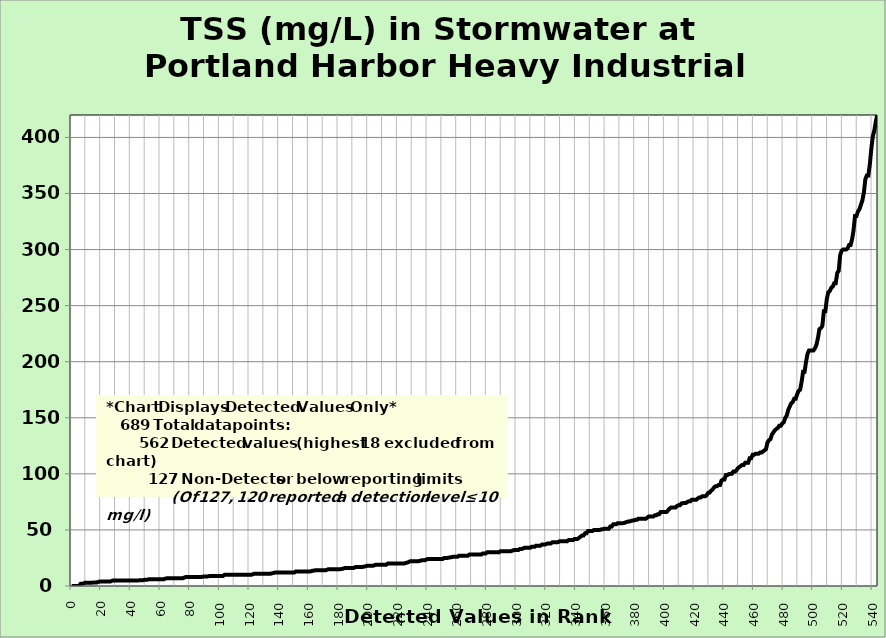
| Category | TSS |
|---|---|
| 0.0 | 0.005 |
| 1.0 | 0.008 |
| 2.0 | 0.01 |
| 3.0 | 0.016 |
| 4.0 | 0.082 |
| 5.0 | 0.092 |
| 6.0 | 2 |
| 7.0 | 2 |
| 8.0 | 2.2 |
| 9.0 | 3 |
| 10.0 | 3 |
| 11.0 | 3 |
| 12.0 | 3 |
| 13.0 | 3 |
| 14.0 | 3 |
| 15.0 | 3.2 |
| 16.0 | 3.2 |
| 17.0 | 3.2 |
| 18.0 | 3.8 |
| 19.0 | 3.9 |
| 20.0 | 4 |
| 21.0 | 4 |
| 22.0 | 4 |
| 23.0 | 4 |
| 24.0 | 4 |
| 25.0 | 4 |
| 26.0 | 4 |
| 27.0 | 4.52 |
| 28.0 | 5 |
| 29.0 | 5 |
| 30.0 | 5 |
| 31.0 | 5 |
| 32.0 | 5 |
| 33.0 | 5 |
| 34.0 | 5 |
| 35.0 | 5 |
| 36.0 | 5 |
| 37.0 | 5 |
| 38.0 | 5 |
| 39.0 | 5 |
| 40.0 | 5 |
| 41.0 | 5 |
| 42.0 | 5 |
| 43.0 | 5 |
| 44.0 | 5 |
| 45.0 | 5 |
| 46.0 | 5.1 |
| 47.0 | 5.2 |
| 48.0 | 5.2 |
| 49.0 | 5.5 |
| 50.0 | 5.6 |
| 51.0 | 5.6 |
| 52.0 | 6 |
| 53.0 | 6 |
| 54.0 | 6 |
| 55.0 | 6 |
| 56.0 | 6 |
| 57.0 | 6 |
| 58.0 | 6 |
| 59.0 | 6 |
| 60.0 | 6 |
| 61.0 | 6 |
| 62.0 | 6 |
| 63.0 | 6.57 |
| 64.0 | 6.8 |
| 65.0 | 6.86 |
| 66.0 | 7 |
| 67.0 | 7 |
| 68.0 | 7 |
| 69.0 | 7 |
| 70.0 | 7 |
| 71.0 | 7 |
| 72.0 | 7 |
| 73.0 | 7 |
| 74.0 | 7 |
| 75.0 | 7 |
| 76.0 | 7.6 |
| 77.0 | 8 |
| 78.0 | 8 |
| 79.0 | 8 |
| 80.0 | 8 |
| 81.0 | 8 |
| 82.0 | 8 |
| 83.0 | 8 |
| 84.0 | 8 |
| 85.0 | 8 |
| 86.0 | 8 |
| 87.0 | 8 |
| 88.0 | 8.2 |
| 89.0 | 8.46 |
| 90.0 | 8.5 |
| 91.0 | 8.5 |
| 92.0 | 8.6 |
| 93.0 | 9 |
| 94.0 | 9 |
| 95.0 | 9 |
| 96.0 | 9 |
| 97.0 | 9 |
| 98.0 | 9 |
| 99.0 | 9 |
| 100.0 | 9 |
| 101.0 | 9 |
| 102.0 | 9 |
| 103.0 | 10 |
| 104.0 | 10 |
| 105.0 | 10 |
| 106.0 | 10 |
| 107.0 | 10 |
| 108.0 | 10 |
| 109.0 | 10 |
| 110.0 | 10 |
| 111.0 | 10 |
| 112.0 | 10 |
| 113.0 | 10 |
| 114.0 | 10 |
| 115.0 | 10 |
| 116.0 | 10 |
| 117.0 | 10 |
| 118.0 | 10 |
| 119.0 | 10 |
| 120.0 | 10 |
| 121.0 | 10 |
| 122.0 | 10.4 |
| 123.0 | 11 |
| 124.0 | 11 |
| 125.0 | 11 |
| 126.0 | 11 |
| 127.0 | 11 |
| 128.0 | 11 |
| 129.0 | 11 |
| 130.0 | 11 |
| 131.0 | 11 |
| 132.0 | 11 |
| 133.0 | 11 |
| 134.0 | 11 |
| 135.0 | 11.3 |
| 136.0 | 11.6 |
| 137.0 | 12 |
| 138.0 | 12 |
| 139.0 | 12 |
| 140.0 | 12 |
| 141.0 | 12 |
| 142.0 | 12 |
| 143.0 | 12 |
| 144.0 | 12 |
| 145.0 | 12 |
| 146.0 | 12 |
| 147.0 | 12 |
| 148.0 | 12 |
| 149.0 | 12 |
| 150.0 | 12 |
| 151.0 | 13 |
| 152.0 | 13 |
| 153.0 | 13 |
| 154.0 | 13 |
| 155.0 | 13 |
| 156.0 | 13 |
| 157.0 | 13 |
| 158.0 | 13 |
| 159.0 | 13 |
| 160.0 | 13 |
| 161.0 | 13 |
| 162.0 | 13.5 |
| 163.0 | 13.6 |
| 164.0 | 14 |
| 165.0 | 14 |
| 166.0 | 14 |
| 167.0 | 14 |
| 168.0 | 14 |
| 169.0 | 14 |
| 170.0 | 14 |
| 171.0 | 14 |
| 172.0 | 14.4 |
| 173.0 | 15 |
| 174.0 | 15 |
| 175.0 | 15 |
| 176.0 | 15 |
| 177.0 | 15 |
| 178.0 | 15 |
| 179.0 | 15 |
| 180.0 | 15 |
| 181.0 | 15 |
| 182.0 | 15.2 |
| 183.0 | 15.5 |
| 184.0 | 16 |
| 185.0 | 16 |
| 186.0 | 16 |
| 187.0 | 16 |
| 188.0 | 16 |
| 189.0 | 16 |
| 190.0 | 16 |
| 191.0 | 16.8 |
| 192.0 | 17 |
| 193.0 | 17 |
| 194.0 | 17 |
| 195.0 | 17 |
| 196.0 | 17 |
| 197.0 | 17.3 |
| 198.0 | 17.5 |
| 199.0 | 18 |
| 200.0 | 18 |
| 201.0 | 18 |
| 202.0 | 18 |
| 203.0 | 18 |
| 204.0 | 18.5 |
| 205.0 | 19 |
| 206.0 | 19 |
| 207.0 | 19 |
| 208.0 | 19 |
| 209.0 | 19 |
| 210.0 | 19 |
| 211.0 | 19 |
| 212.0 | 19 |
| 213.0 | 20 |
| 214.0 | 20 |
| 215.0 | 20 |
| 216.0 | 20 |
| 217.0 | 20 |
| 218.0 | 20 |
| 219.0 | 20 |
| 220.0 | 20 |
| 221.0 | 20 |
| 222.0 | 20 |
| 223.0 | 20 |
| 224.0 | 20 |
| 225.0 | 20.5 |
| 226.0 | 20.8 |
| 227.0 | 21.3 |
| 228.0 | 22 |
| 229.0 | 22 |
| 230.0 | 22 |
| 231.0 | 22 |
| 232.0 | 22 |
| 233.0 | 22 |
| 234.0 | 22.2 |
| 235.0 | 22.5 |
| 236.0 | 23 |
| 237.0 | 23 |
| 238.0 | 23 |
| 239.0 | 23.6 |
| 240.0 | 24 |
| 241.0 | 24 |
| 242.0 | 24 |
| 243.0 | 24 |
| 244.0 | 24 |
| 245.0 | 24 |
| 246.0 | 24 |
| 247.0 | 24 |
| 248.0 | 24 |
| 249.0 | 24 |
| 250.0 | 24 |
| 251.0 | 25 |
| 252.0 | 25 |
| 253.0 | 25 |
| 254.0 | 25.2 |
| 255.0 | 25.5 |
| 256.0 | 25.7 |
| 257.0 | 26 |
| 258.0 | 26 |
| 259.0 | 26 |
| 260.0 | 26 |
| 261.0 | 27 |
| 262.0 | 27 |
| 263.0 | 27 |
| 264.0 | 27 |
| 265.0 | 27 |
| 266.0 | 27 |
| 267.0 | 27 |
| 268.0 | 28 |
| 269.0 | 28 |
| 270.0 | 28 |
| 271.0 | 28 |
| 272.0 | 28 |
| 273.0 | 28 |
| 274.0 | 28 |
| 275.0 | 28 |
| 276.0 | 28 |
| 277.0 | 29 |
| 278.0 | 29 |
| 279.0 | 29 |
| 280.0 | 30 |
| 281.0 | 30 |
| 282.0 | 30 |
| 283.0 | 30 |
| 284.0 | 30 |
| 285.0 | 30 |
| 286.0 | 30 |
| 287.0 | 30 |
| 288.0 | 30 |
| 289.0 | 31 |
| 290.0 | 31 |
| 291.0 | 31 |
| 292.0 | 31 |
| 293.0 | 31 |
| 294.0 | 31 |
| 295.0 | 31 |
| 296.0 | 31 |
| 297.0 | 31.5 |
| 298.0 | 32 |
| 299.0 | 32 |
| 300.0 | 32 |
| 301.0 | 32 |
| 302.0 | 33 |
| 303.0 | 33 |
| 304.0 | 33.3 |
| 305.0 | 34 |
| 306.0 | 34 |
| 307.0 | 34 |
| 308.0 | 34 |
| 309.0 | 34 |
| 310.0 | 35 |
| 311.0 | 35 |
| 312.0 | 35 |
| 313.0 | 36 |
| 314.0 | 36 |
| 315.0 | 36 |
| 316.0 | 36 |
| 317.0 | 37 |
| 318.0 | 37 |
| 319.0 | 37 |
| 320.0 | 37.5 |
| 321.0 | 38 |
| 322.0 | 38 |
| 323.0 | 38 |
| 324.0 | 39 |
| 325.0 | 39 |
| 326.0 | 39 |
| 327.0 | 39 |
| 328.0 | 39.2 |
| 329.0 | 40 |
| 330.0 | 40 |
| 331.0 | 40 |
| 332.0 | 40 |
| 333.0 | 40 |
| 334.0 | 40 |
| 335.0 | 41 |
| 336.0 | 41 |
| 337.0 | 41 |
| 338.0 | 41 |
| 339.0 | 42 |
| 340.0 | 42 |
| 341.0 | 42 |
| 342.0 | 43 |
| 343.0 | 44 |
| 344.0 | 45 |
| 345.0 | 45 |
| 346.0 | 47 |
| 347.0 | 47 |
| 348.0 | 49 |
| 349.0 | 49 |
| 350.0 | 49 |
| 351.0 | 49 |
| 352.0 | 50 |
| 353.0 | 50 |
| 354.0 | 50 |
| 355.0 | 50 |
| 356.0 | 50 |
| 357.0 | 50.5 |
| 358.0 | 50.5 |
| 359.0 | 51 |
| 360.0 | 51 |
| 361.0 | 51 |
| 362.0 | 51 |
| 363.0 | 53 |
| 364.0 | 53 |
| 365.0 | 55 |
| 366.0 | 55 |
| 367.0 | 55 |
| 368.0 | 56 |
| 369.0 | 56 |
| 370.0 | 56 |
| 371.0 | 56 |
| 372.0 | 56.1 |
| 373.0 | 56.5 |
| 374.0 | 57.1 |
| 375.0 | 57.5 |
| 376.0 | 57.6 |
| 377.0 | 58 |
| 378.0 | 58.5 |
| 379.0 | 58.5 |
| 380.0 | 59 |
| 381.0 | 59 |
| 382.0 | 60 |
| 383.0 | 60 |
| 384.0 | 60 |
| 385.0 | 60 |
| 386.0 | 60 |
| 387.0 | 60 |
| 388.0 | 61 |
| 389.0 | 62 |
| 390.0 | 62 |
| 391.0 | 62 |
| 392.0 | 62 |
| 393.0 | 63 |
| 394.0 | 63 |
| 395.0 | 64 |
| 396.0 | 64 |
| 397.0 | 66 |
| 398.0 | 66 |
| 399.0 | 66 |
| 400.0 | 66 |
| 401.0 | 66 |
| 402.0 | 67.5 |
| 403.0 | 69 |
| 404.0 | 70 |
| 405.0 | 70 |
| 406.0 | 70 |
| 407.0 | 70 |
| 408.0 | 71.3 |
| 409.0 | 72 |
| 410.0 | 72 |
| 411.0 | 73.6 |
| 412.0 | 73.9 |
| 413.0 | 74 |
| 414.0 | 74 |
| 415.0 | 75 |
| 416.0 | 75.5 |
| 417.0 | 75.5 |
| 418.0 | 77 |
| 419.0 | 77 |
| 420.0 | 77 |
| 421.0 | 77 |
| 422.0 | 78 |
| 423.0 | 79 |
| 424.0 | 79 |
| 425.0 | 80 |
| 426.0 | 80 |
| 427.0 | 80 |
| 428.0 | 81 |
| 429.0 | 83 |
| 430.0 | 83.3 |
| 431.0 | 85 |
| 432.0 | 86 |
| 433.0 | 88 |
| 434.0 | 89 |
| 435.0 | 89 |
| 436.0 | 90 |
| 437.0 | 90 |
| 438.0 | 94 |
| 439.0 | 95 |
| 440.0 | 95 |
| 441.0 | 99 |
| 442.0 | 99 |
| 443.0 | 99.8 |
| 444.0 | 100 |
| 445.0 | 100 |
| 446.0 | 102 |
| 447.0 | 102 |
| 448.0 | 103 |
| 449.0 | 105 |
| 450.0 | 106 |
| 451.0 | 107 |
| 452.0 | 108 |
| 453.0 | 108 |
| 454.0 | 110 |
| 455.0 | 110 |
| 456.0 | 110 |
| 457.0 | 114 |
| 458.0 | 114 |
| 459.0 | 117 |
| 460.0 | 117 |
| 461.0 | 118 |
| 462.0 | 118 |
| 463.0 | 118 |
| 464.0 | 119 |
| 465.0 | 119 |
| 466.0 | 120 |
| 467.0 | 121 |
| 468.0 | 122 |
| 469.0 | 128 |
| 470.0 | 130 |
| 471.0 | 131 |
| 472.0 | 135 |
| 473.0 | 137 |
| 474.0 | 139 |
| 475.0 | 140 |
| 476.0 | 141 |
| 477.0 | 143 |
| 478.0 | 143 |
| 479.0 | 145 |
| 480.0 | 146 |
| 481.0 | 150 |
| 482.0 | 152 |
| 483.0 | 157 |
| 484.0 | 160 |
| 485.0 | 163 |
| 486.0 | 164 |
| 487.0 | 167 |
| 488.0 | 167 |
| 489.0 | 171 |
| 490.0 | 174 |
| 491.0 | 175 |
| 492.0 | 182 |
| 493.0 | 191 |
| 494.0 | 191 |
| 495.0 | 200 |
| 496.0 | 207 |
| 497.0 | 210 |
| 498.0 | 210 |
| 499.0 | 210 |
| 500.0 | 210 |
| 501.0 | 212 |
| 502.0 | 215 |
| 503.0 | 221 |
| 504.0 | 229 |
| 505.0 | 230 |
| 506.0 | 232 |
| 507.0 | 245 |
| 508.0 | 245 |
| 509.0 | 256 |
| 510.0 | 262 |
| 511.0 | 263 |
| 512.0 | 266 |
| 513.0 | 267 |
| 514.0 | 270 |
| 515.0 | 270 |
| 516.0 | 279 |
| 517.0 | 281 |
| 518.0 | 295 |
| 519.0 | 299 |
| 520.0 | 300 |
| 521.0 | 300 |
| 522.0 | 300 |
| 523.0 | 301 |
| 524.0 | 304 |
| 525.0 | 304 |
| 526.0 | 309 |
| 527.0 | 317 |
| 528.0 | 330 |
| 529.0 | 330 |
| 530.0 | 334 |
| 531.0 | 336 |
| 532.0 | 340 |
| 533.0 | 344 |
| 534.0 | 351 |
| 535.0 | 363 |
| 536.0 | 366 |
| 537.0 | 366 |
| 538.0 | 376 |
| 539.0 | 390 |
| 540.0 | 401 |
| 541.0 | 406 |
| 542.0 | 414 |
| 543.0 | 420 |